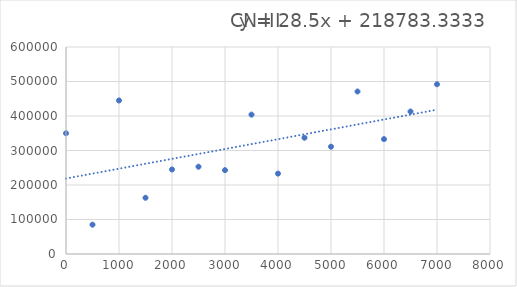
| Category | CN III |
|---|---|
| 0.0 | 350000 |
| 500.0 | 85000 |
| 1000.0 | 445000 |
| 1500.0 | 163000 |
| 2000.0 | 245000 |
| 2500.0 | 253000 |
| 3000.0 | 243000 |
| 3500.0 | 404000 |
| 4000.0 | 233000 |
| 4500.0 | 337000 |
| 5000.0 | 311000 |
| 5500.0 | 471000 |
| 6000.0 | 333000 |
| 6500.0 | 413000 |
| 7000.0 | 492000 |